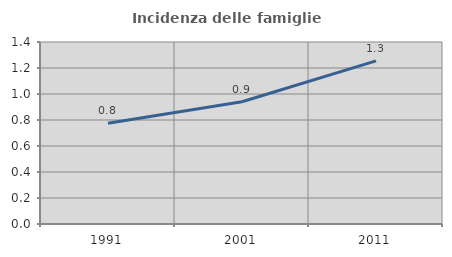
| Category | Incidenza delle famiglie numerose |
|---|---|
| 1991.0 | 0.776 |
| 2001.0 | 0.94 |
| 2011.0 | 1.254 |